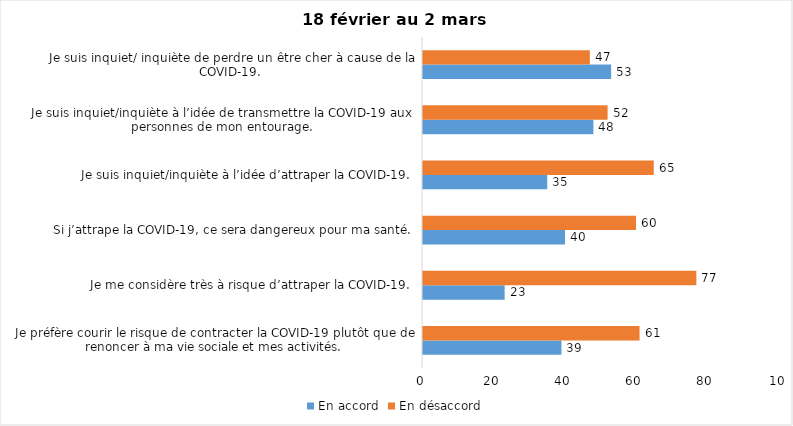
| Category | En accord | En désaccord |
|---|---|---|
| Je préfère courir le risque de contracter la COVID-19 plutôt que de renoncer à ma vie sociale et mes activités. | 39 | 61 |
| Je me considère très à risque d’attraper la COVID-19. | 23 | 77 |
| Si j’attrape la COVID-19, ce sera dangereux pour ma santé. | 40 | 60 |
| Je suis inquiet/inquiète à l’idée d’attraper la COVID-19. | 35 | 65 |
| Je suis inquiet/inquiète à l’idée de transmettre la COVID-19 aux personnes de mon entourage. | 48 | 52 |
| Je suis inquiet/ inquiète de perdre un être cher à cause de la COVID-19. | 53 | 47 |